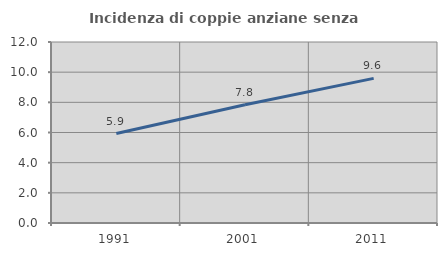
| Category | Incidenza di coppie anziane senza figli  |
|---|---|
| 1991.0 | 5.932 |
| 2001.0 | 7.834 |
| 2011.0 | 9.589 |